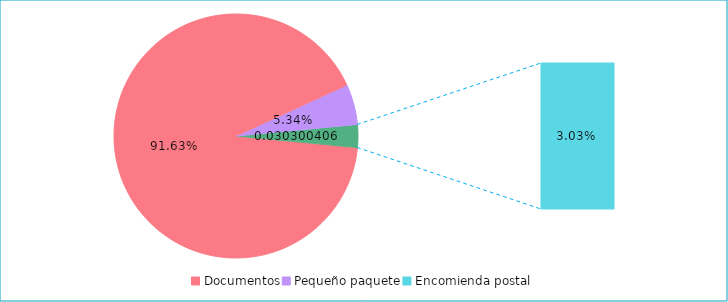
| Category | Series 0 |
|---|---|
| Documentos | 0.916 |
| Pequeño paquete | 0.053 |
| Encomienda postal | 0.03 |